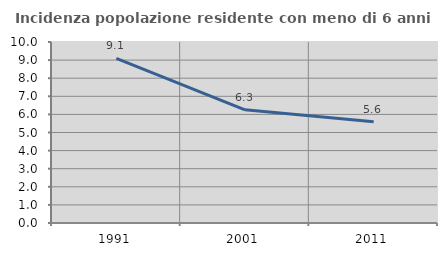
| Category | Incidenza popolazione residente con meno di 6 anni |
|---|---|
| 1991.0 | 9.091 |
| 2001.0 | 6.255 |
| 2011.0 | 5.599 |